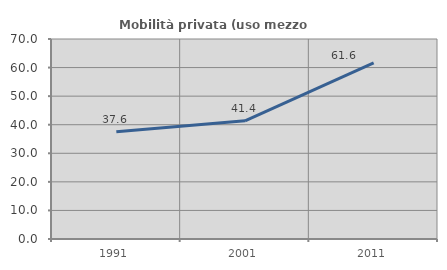
| Category | Mobilità privata (uso mezzo privato) |
|---|---|
| 1991.0 | 37.558 |
| 2001.0 | 41.356 |
| 2011.0 | 61.615 |